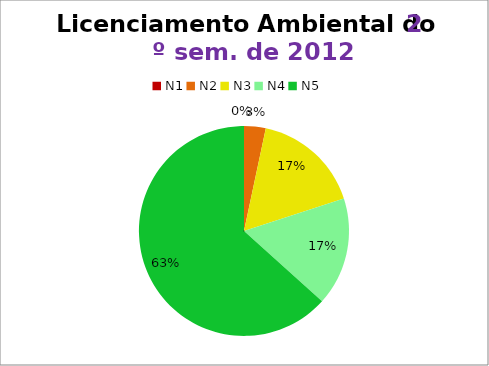
| Category | 2º/12 |
|---|---|
| N1 | 0 |
| N2 | 1 |
| N3 | 5 |
| N4 | 5 |
| N5 | 19 |